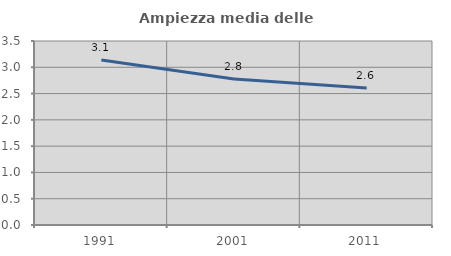
| Category | Ampiezza media delle famiglie |
|---|---|
| 1991.0 | 3.138 |
| 2001.0 | 2.778 |
| 2011.0 | 2.607 |